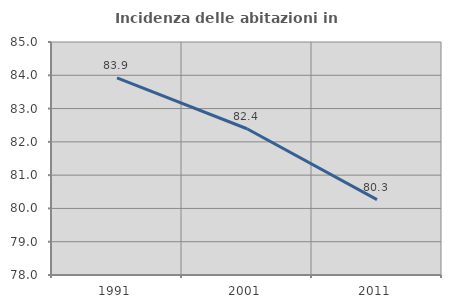
| Category | Incidenza delle abitazioni in proprietà  |
|---|---|
| 1991.0 | 83.922 |
| 2001.0 | 82.394 |
| 2011.0 | 80.263 |